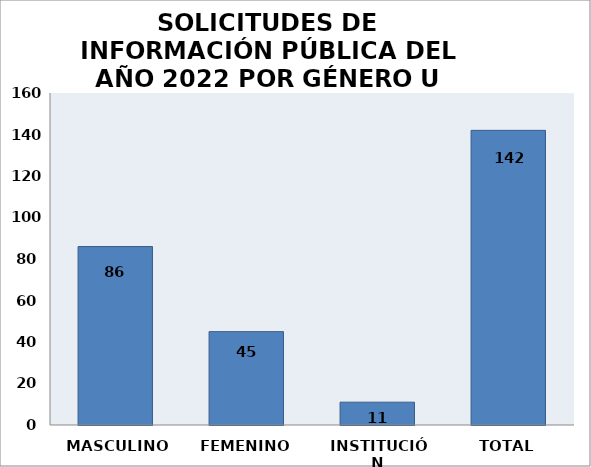
| Category | Series 0 |
|---|---|
| MASCULINO | 86 |
| FEMENINO | 45 |
| INSTITUCIÓN | 11 |
| TOTAL | 142 |